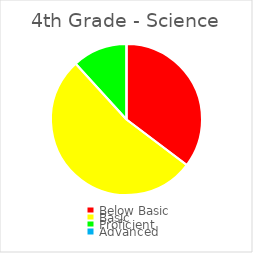
| Category | Series 0 |
|---|---|
| Below Basic | 0.353 |
| Basic | 0.529 |
| Proficient | 0.118 |
| Advanced | 0 |